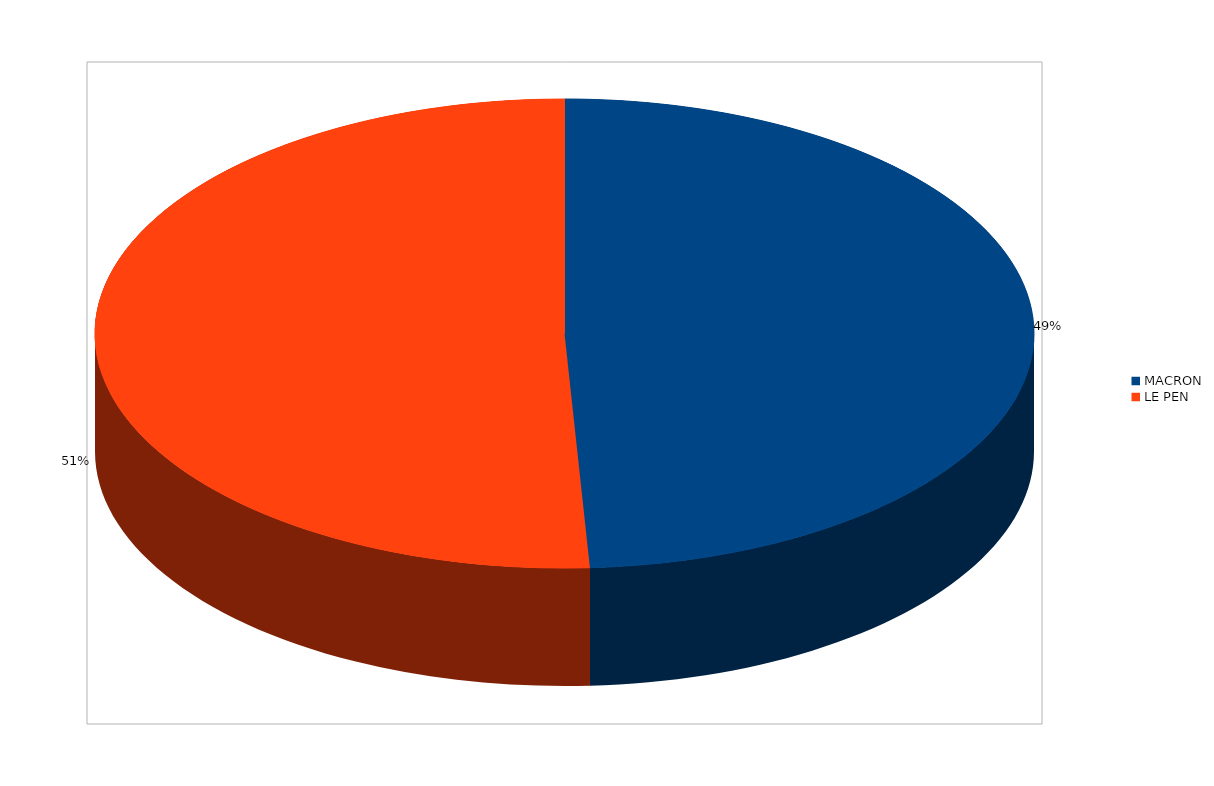
| Category | Series 0 |
|---|---|
| MACRON | 2850 |
| LE PEN | 2950 |